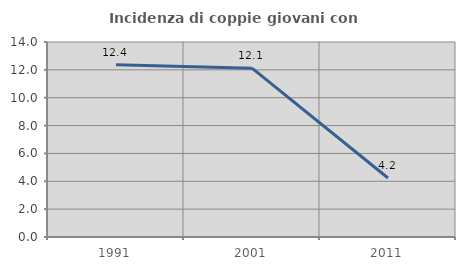
| Category | Incidenza di coppie giovani con figli |
|---|---|
| 1991.0 | 12.371 |
| 2001.0 | 12.121 |
| 2011.0 | 4.237 |